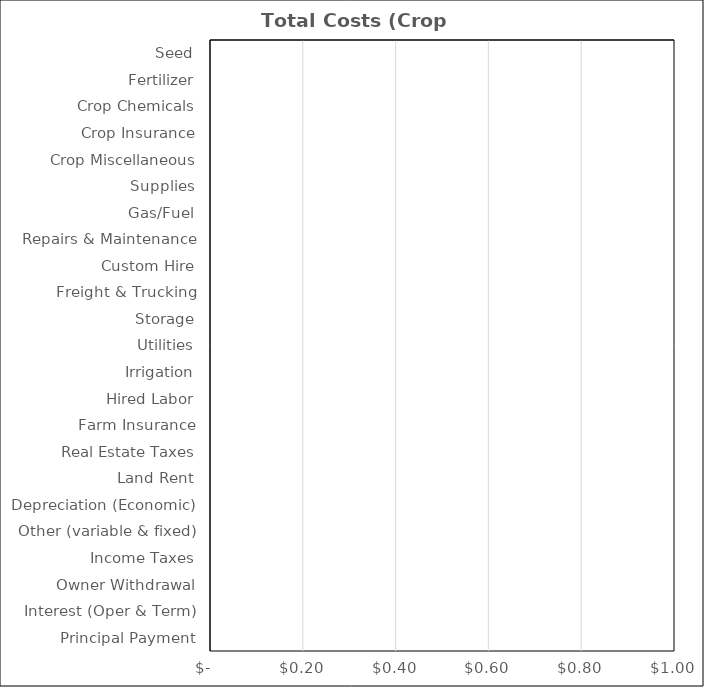
| Category | Corn |
|---|---|
| Seed | 0 |
| Fertilizer | 0 |
| Crop Chemicals | 0 |
| Crop Insurance | 0 |
| Crop Miscellaneous | 0 |
| Supplies | 0 |
| Gas/Fuel | 0 |
| Repairs & Maintenance | 0 |
| Custom Hire | 0 |
| Freight & Trucking | 0 |
| Storage | 0 |
| Utilities | 0 |
| Irrigation | 0 |
| Hired Labor | 0 |
| Farm Insurance | 0 |
| Real Estate Taxes | 0 |
| Land Rent | 0 |
| Depreciation (Economic) | 0 |
| Other (variable & fixed) | 0 |
| Income Taxes | 0 |
| Owner Withdrawal | 0 |
| Interest (Oper & Term) | 0 |
| Principal Payment | 0 |